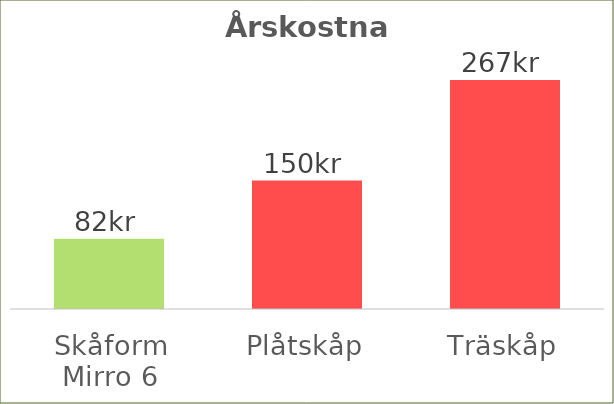
| Category | Årskostnad |
|---|---|
| Skåform Mirro 6 | 82.127 |
| Plåtskåp | 149.902 |
| Träskåp | 267.353 |